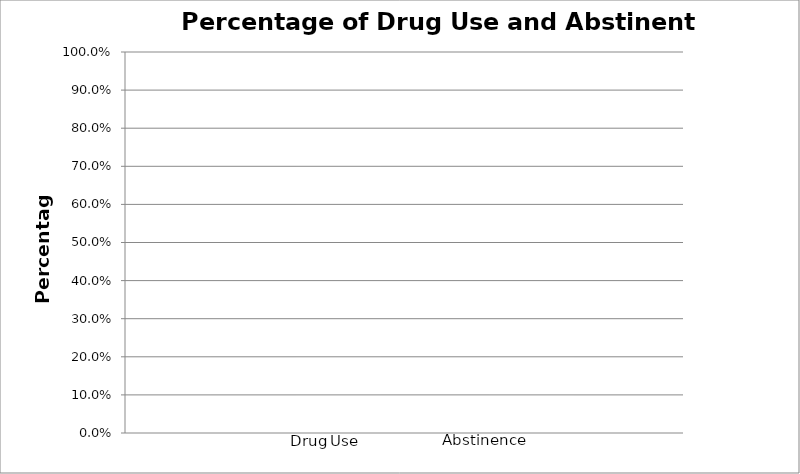
| Category | Percentage of Days Using Drugs: | Percentage of Abstinent Days: |
|---|---|---|
| 0 | 0 | 0 |